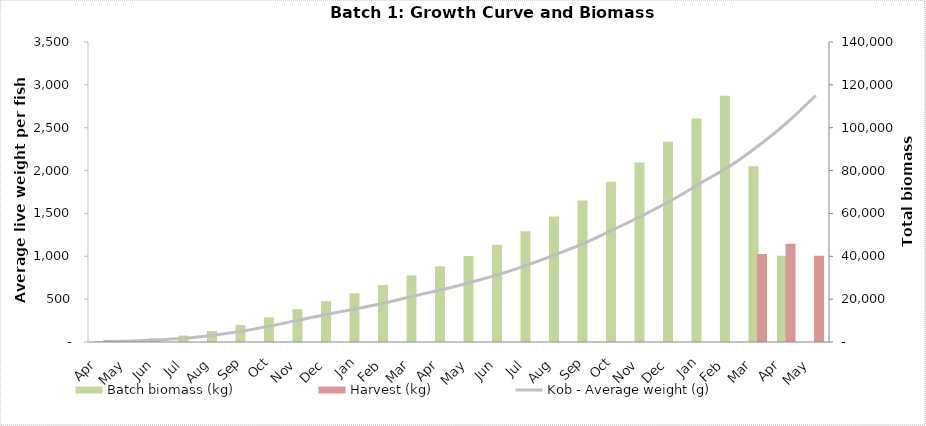
| Category | Batch biomass (kg) | Harvest (kg) |
|---|---|---|
| Apr | 374.94 | 0 |
| May | 818.337 | 0 |
| Jun | 1774.794 | 0 |
| Jul | 3009.829 | 0 |
| Aug | 5104.292 | 0 |
| Sep | 7934.745 | 0 |
| Oct | 11456.207 | 0 |
| Nov | 15309.276 | 0 |
| Dec | 19076.073 | 0 |
| Jan | 22706.044 | 0 |
| Feb | 26569.82 | 0 |
| Mar | 31074.808 | 0 |
| Apr | 35309.935 | 0 |
| May | 40137.909 | 0 |
| Jun | 45434.851 | 0 |
| Jul | 51648.301 | 0 |
| Aug | 58594.811 | 0 |
| Sep | 66075.308 | 0 |
| Oct | 74814.805 | 0 |
| Nov | 83763.15 | 0 |
| Dec | 93446.658 | 0 |
| Jan | 104249.636 | 0 |
| Feb | 114874.01 | 0 |
| Mar | 82068.203 | 41099.915 |
| Apr | 40287.448 | 45863.432 |
| May | 0 | 40206.873 |